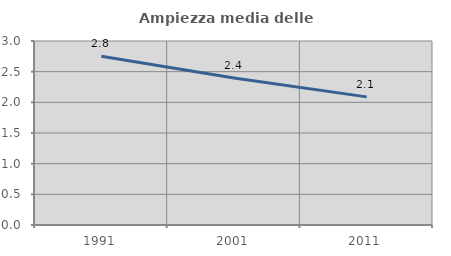
| Category | Ampiezza media delle famiglie |
|---|---|
| 1991.0 | 2.752 |
| 2001.0 | 2.398 |
| 2011.0 | 2.089 |